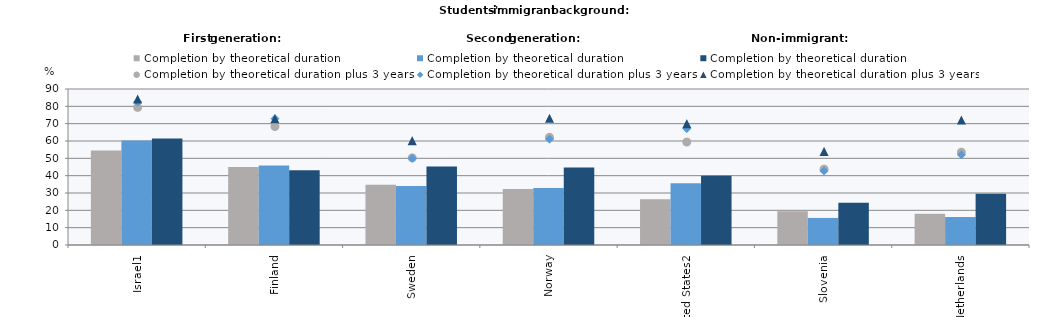
| Category | Completion by theoretical duration |
|---|---|
| Israel1 | 61.405 |
| Finland | 43.128 |
| Sweden | 45.33 |
| Norway | 44.681 |
| United States2 | 39.883 |
| Slovenia | 24.364 |
| Netherlands | 29.57 |